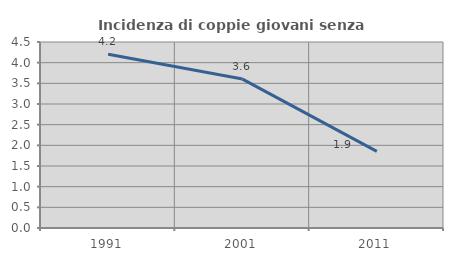
| Category | Incidenza di coppie giovani senza figli |
|---|---|
| 1991.0 | 4.206 |
| 2001.0 | 3.603 |
| 2011.0 | 1.854 |